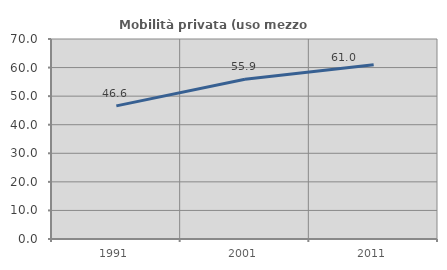
| Category | Mobilità privata (uso mezzo privato) |
|---|---|
| 1991.0 | 46.599 |
| 2001.0 | 55.944 |
| 2011.0 | 61.017 |